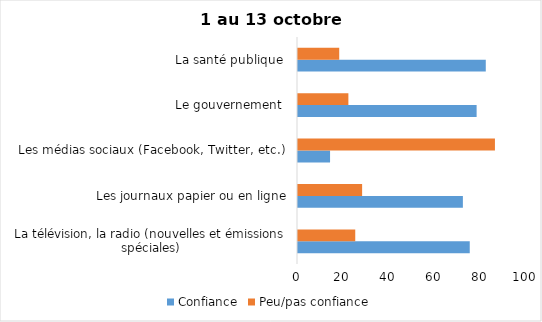
| Category | Confiance | Peu/pas confiance |
|---|---|---|
| La télévision, la radio (nouvelles et émissions spéciales) | 75 | 25 |
| Les journaux papier ou en ligne | 72 | 28 |
| Les médias sociaux (Facebook, Twitter, etc.) | 14 | 86 |
| Le gouvernement  | 78 | 22 |
| La santé publique  | 82 | 18 |